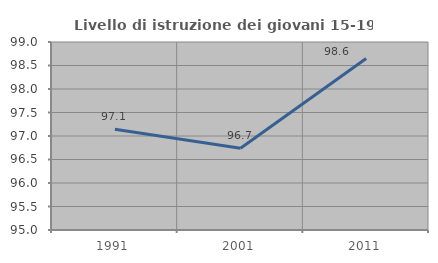
| Category | Livello di istruzione dei giovani 15-19 anni |
|---|---|
| 1991.0 | 97.143 |
| 2001.0 | 96.739 |
| 2011.0 | 98.649 |